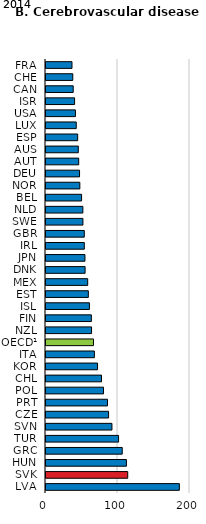
| Category | 2014 |
|---|---|
| FRA | 36.1 |
| CHE | 37.2 |
| CAN | 37.8 |
| ISR | 39.7 |
| USA | 40.9 |
| LUX | 42 |
| ESP | 44 |
| AUS | 44.9 |
| AUT | 45.4 |
| DEU | 46.6 |
| NOR | 47 |
| BEL | 49.4 |
| NLD | 51.2 |
| SWE | 51.3 |
| GBR | 53.2 |
| IRL | 53.2 |
| JPN | 54.1 |
| DNK | 54.3 |
| MEX | 57.9 |
| EST | 58.8 |
| ISL | 60.3 |
| FIN | 63 |
| NZL | 63.3 |
| OECD¹ | 65.954 |
| ITA | 67.2 |
| KOR | 71.6 |
| CHL | 77.1 |
| POL | 79.9 |
| PRT | 85.4 |
| CZE | 86.9 |
| SVN | 91.6 |
| TUR | 100.8 |
| GRC | 105.9 |
| HUN | 111.7 |
| SVK | 113.5 |
| LVA | 185.2 |